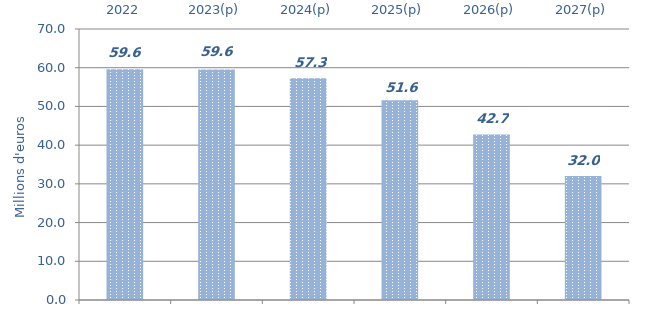
| Category | ATMP |
|---|---|
| 2022 | 59.604 |
| 2023(p) | 59.56 |
| 2024(p) | 57.274 |
| 2025(p) | 51.569 |
| 2026(p) | 42.738 |
| 2027(p) | 32.032 |